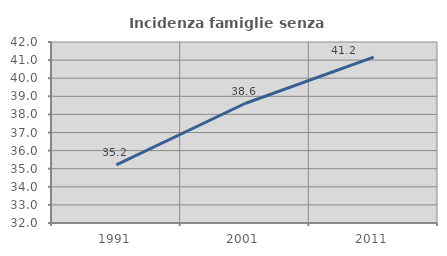
| Category | Incidenza famiglie senza nuclei |
|---|---|
| 1991.0 | 35.211 |
| 2001.0 | 38.602 |
| 2011.0 | 41.162 |